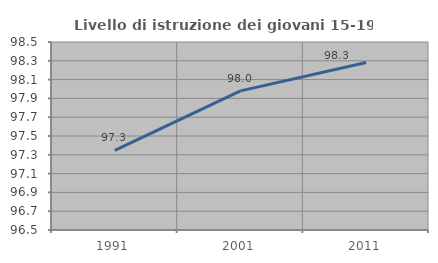
| Category | Livello di istruzione dei giovani 15-19 anni |
|---|---|
| 1991.0 | 97.347 |
| 2001.0 | 97.98 |
| 2011.0 | 98.282 |